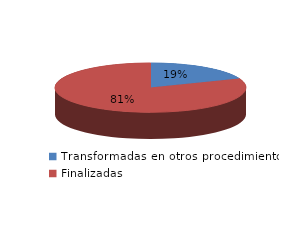
| Category | Series 0 |
|---|---|
| Transformadas en otros procedimientos | 3158 |
| Finalizadas | 13512 |